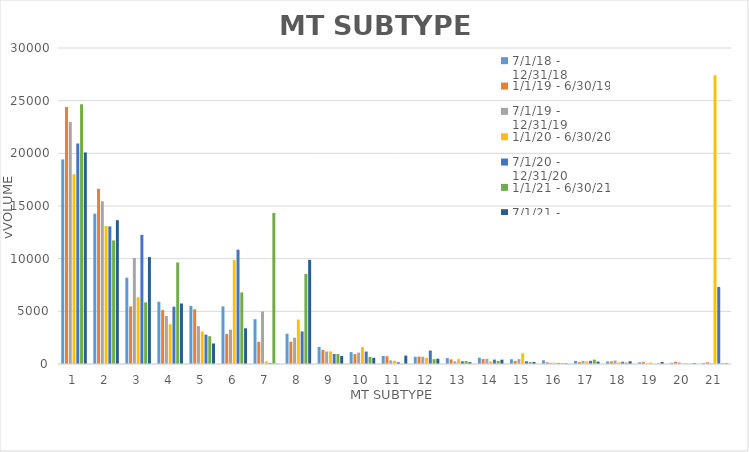
| Category | 7/1/18 - 12/31/18 | 1/1/19 - 6/30/19 | 7/1/19 - 12/31/19 | 1/1/20 - 6/30/20 | 7/1/20 - 12/31/20 | 1/1/21 - 6/30/21 | 7/1/21 - 12/31/21 |
|---|---|---|---|---|---|---|---|
| 1 | 19422 | 24408 | 22969 | 18013 | 20933 | 24670 | 20083 |
| 2 | 14270 | 16636 | 15447 | 13096 | 13063 | 11732 | 13652 |
| 3 | 8188 | 5463 | 10062 | 6345 | 12258 | 5852 | 10147 |
| 4 | 5907 | 5119 | 4550 | 3779 | 5439 | 9641 | 5744 |
| 5 | 5514 | 5198 | 3596 | 3100 | 2787 | 2638 | 1944 |
| 6 | 5464 | 2836 | 3262 | 9857 | 10853 | 6796 | 3389 |
| 7 | 4252 | 2104 | 4991 | 261 | 94 | 14333 | 25 |
| 8 | 2871 | 2118 | 2504 | 4227 | 3094 | 8552 | 9888 |
| 9 | 1612 | 1328 | 1180 | 1204 | 955 | 949 | 763 |
| 10 | 1125 | 936 | 1079 | 1607 | 1181 | 678 | 587 |
| 11 | 767 | 735 | 346 | 312 | 174 | 26 | 798 |
| 12 | 687 | 702 | 685 | 586 | 1281 | 463 | 502 |
| 13 | 559 | 441 | 254 | 464 | 258 | 283 | 177 |
| 14 | 600 | 477 | 498 | 247 | 419 | 282 | 411 |
| 15 | 453 | 296 | 461 | 1012 | 263 | 181 | 193 |
| 16 | 353 | 164 | 114 | 127 | 91 | 71 | 61 |
| 17 | 294 | 186 | 297 | 248 | 302 | 417 | 228 |
| 18 | 235 | 246 | 327 | 159 | 211 | 128 | 260 |
| 19 | 160 | 187 | 32 | 141 | 6 | 63 | 200 |
| 20 | 112 | 217 | 157 | 22 | 34 | 23 | 76 |
| 21 | 98 | 163 | 76 | 27412 | 7317 | 61 | 60 |